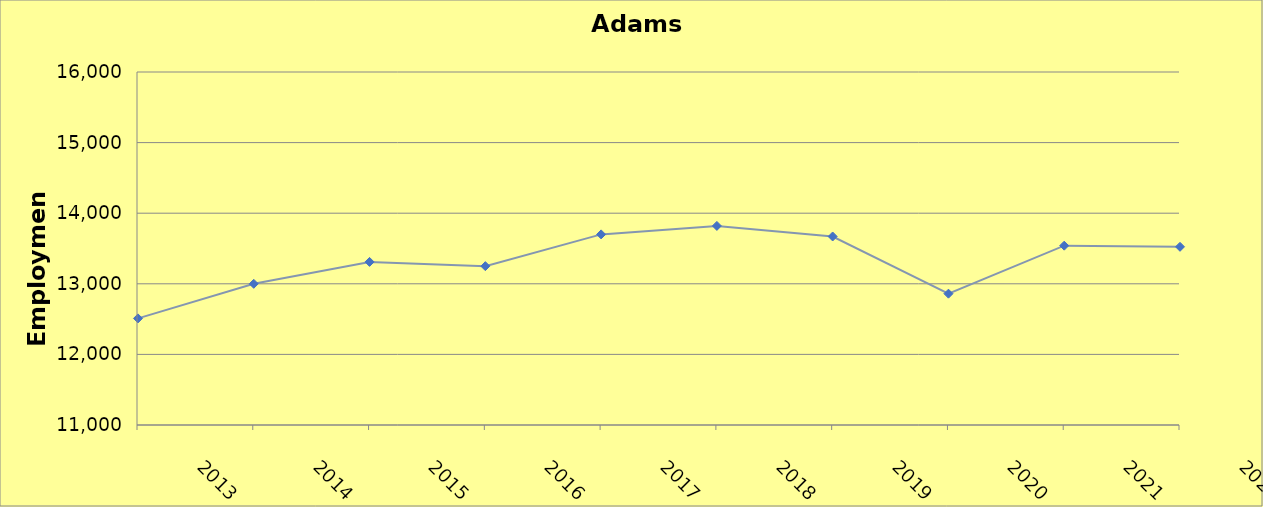
| Category | Adams County |
|---|---|
| 2013.0 | 12510 |
| 2014.0 | 13000 |
| 2015.0 | 13310 |
| 2016.0 | 13250 |
| 2017.0 | 13700 |
| 2018.0 | 13820 |
| 2019.0 | 13670 |
| 2020.0 | 12860 |
| 2021.0 | 13540 |
| 2022.0 | 13524 |